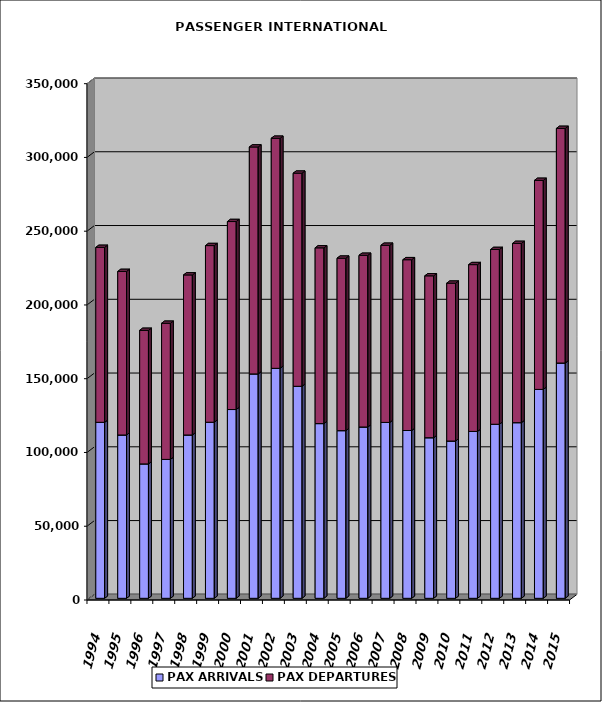
| Category | PAX ARRIVALS | PAX DEPARTURES |
|---|---|---|
| 1994.0 | 119301 | 118568 |
| 1995.0 | 110706 | 110849 |
| 1996.0 | 91119 | 90508 |
| 1997.0 | 94156 | 92276 |
| 1998.0 | 110723 | 108481 |
| 1999.0 | 119351 | 119745 |
| 2000.0 | 127962 | 127432 |
| 2001.0 | 152115 | 153813 |
| 2002.0 | 155897 | 155938 |
| 2003.0 | 143717 | 144456 |
| 2004.0 | 118431 | 119132 |
| 2005.0 | 113659 | 116890 |
| 2006.0 | 116136 | 116357 |
| 2007.0 | 119229 | 120058 |
| 2008.0 | 113740 | 115771 |
| 2009.0 | 108855 | 109746 |
| 2010.0 | 106619 | 106990 |
| 2011.0 | 113125 | 113060 |
| 2012.0 | 117989 | 118451 |
| 2013.0 | 119070 | 121487 |
| 2014.0 | 141609 | 141691 |
| 2015.0 | 159492 | 159031 |